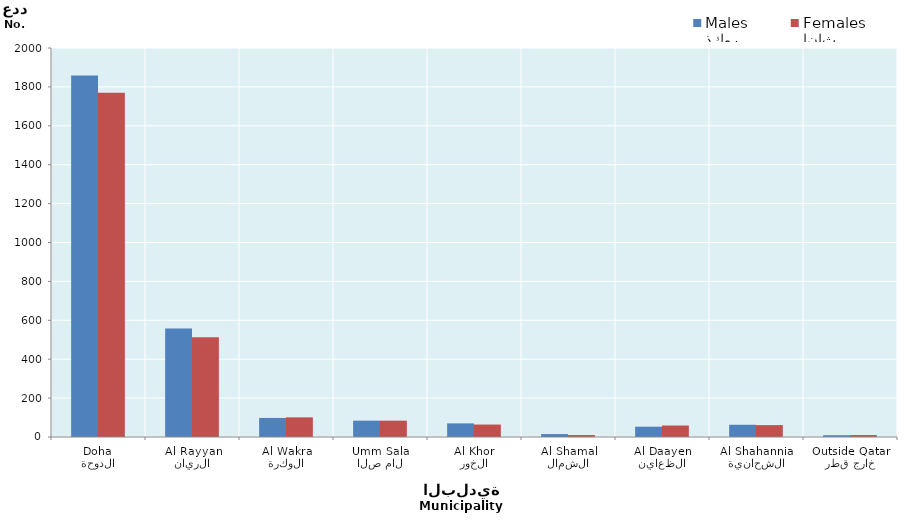
| Category | ذكور
Males | إناث
Females |
|---|---|---|
| الدوحة
Doha | 1858 | 1770 |
| الريان
Al Rayyan | 558 | 513 |
| الوكرة
Al Wakra | 98 | 101 |
| ام صلال
Umm Salal | 84 | 84 |
| الخور
Al Khor | 70 | 64 |
| الشمال
Al Shamal | 15 | 10 |
| الظعاين
Al Daayen | 53 | 59 |
| الشحانية
Al Shahannia | 63 | 61 |
| خارج قطر
Outside Qatar | 9 | 10 |